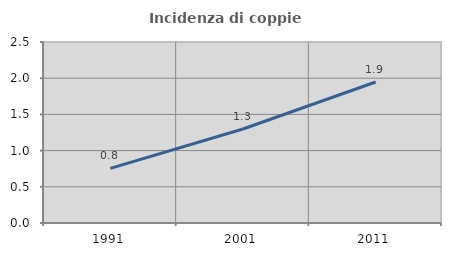
| Category | Incidenza di coppie miste |
|---|---|
| 1991.0 | 0.754 |
| 2001.0 | 1.299 |
| 2011.0 | 1.947 |